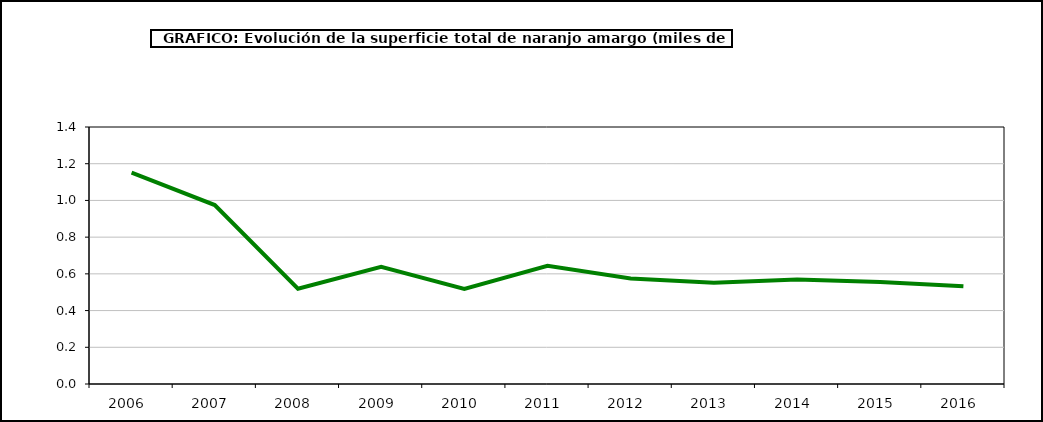
| Category | superficie |
|---|---|
| 2006.0 | 1.151 |
| 2007.0 | 0.975 |
| 2008.0 | 0.519 |
| 2009.0 | 0.639 |
| 2010.0 | 0.518 |
| 2011.0 | 0.644 |
| 2012.0 | 0.575 |
| 2013.0 | 0.552 |
| 2014.0 | 0.569 |
| 2015.0 | 0.556 |
| 2016.0 | 0.532 |